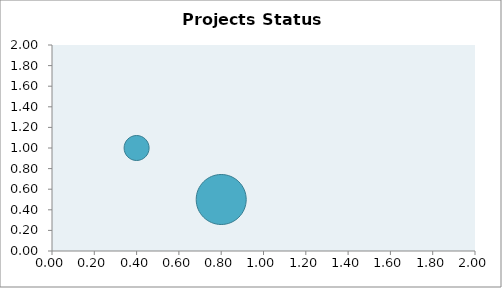
| Category | CPI |
|---|---|
| 0.4 | 1 |
| 0.8 | 0.5 |